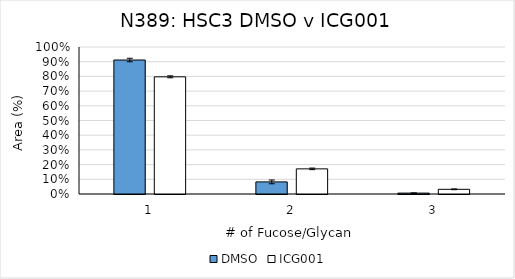
| Category | DMSO | ICG001 |
|---|---|---|
| 0 | 0.911 | 0.797 |
| 1 | 0.082 | 0.171 |
| 2 | 0.006 | 0.032 |